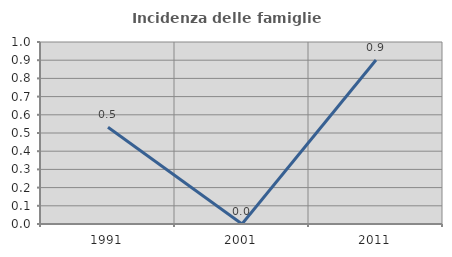
| Category | Incidenza delle famiglie numerose |
|---|---|
| 1991.0 | 0.532 |
| 2001.0 | 0 |
| 2011.0 | 0.901 |